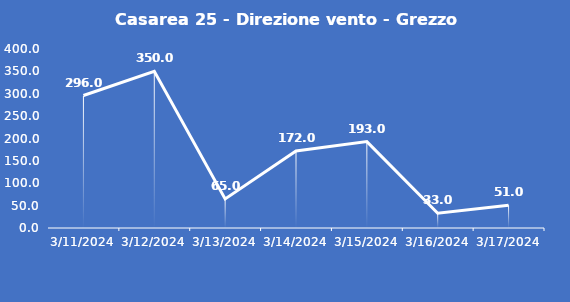
| Category | Casarea 25 - Direzione vento - Grezzo (°N) |
|---|---|
| 3/11/24 | 296 |
| 3/12/24 | 350 |
| 3/13/24 | 65 |
| 3/14/24 | 172 |
| 3/15/24 | 193 |
| 3/16/24 | 33 |
| 3/17/24 | 51 |